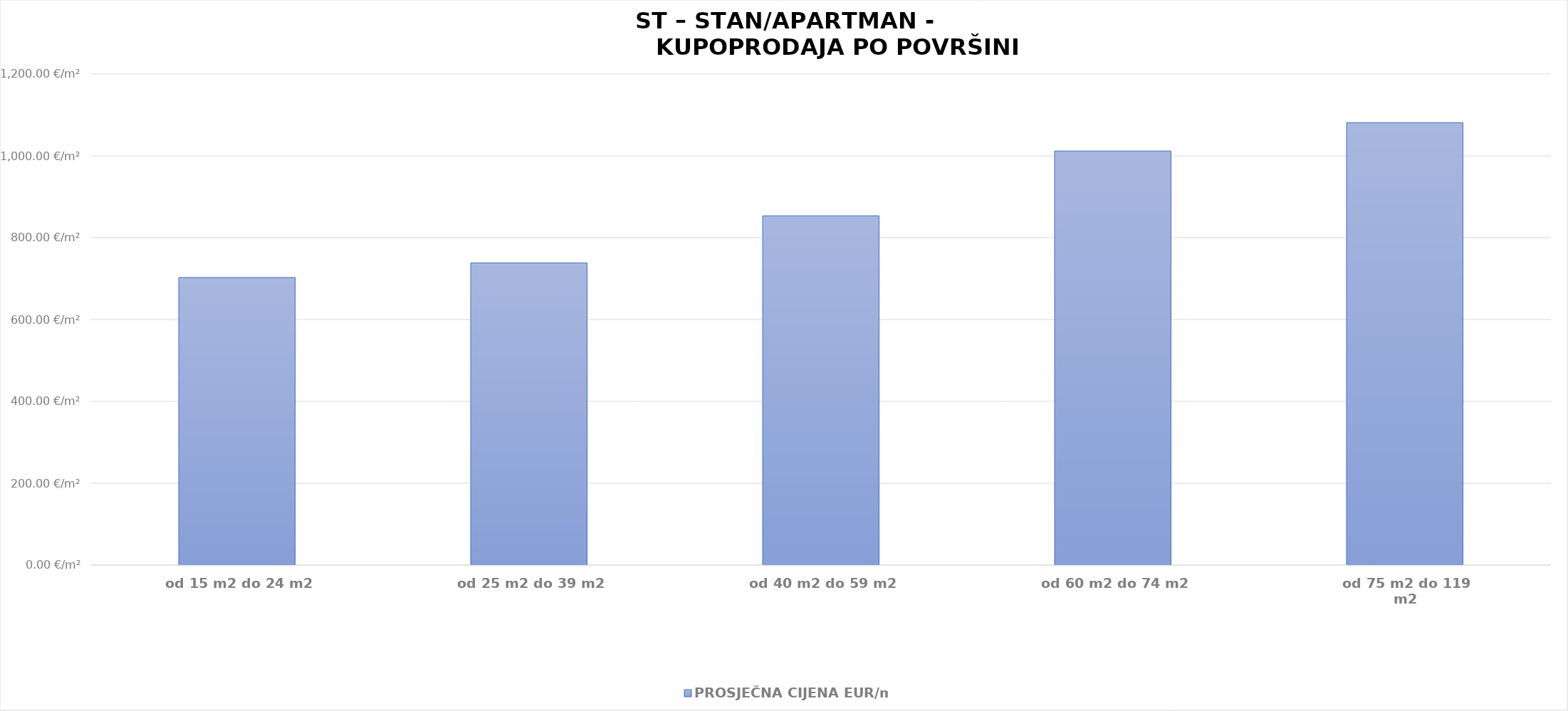
| Category | PROSJEČNA CIJENA EUR/m2 |
|---|---|
| od 15 m2 do 24 m2 | 1901-12-02 17:15:40 |
| od 25 m2 do 39 m2 | 1902-01-07 09:21:54 |
| od 40 m2 do 59 m2 | 1902-05-02 13:59:18 |
| od 60 m2 do 74 m2 | 1902-10-07 21:27:01 |
| od 75 m2 do 119 m2 | 1902-12-16 05:31:17 |